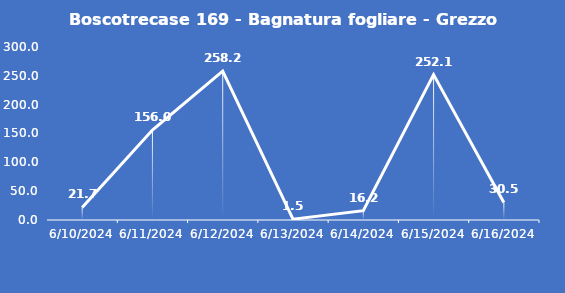
| Category | Boscotrecase 169 - Bagnatura fogliare - Grezzo (min) |
|---|---|
| 6/10/24 | 21.7 |
| 6/11/24 | 156 |
| 6/12/24 | 258.2 |
| 6/13/24 | 1.5 |
| 6/14/24 | 16.2 |
| 6/15/24 | 252.1 |
| 6/16/24 | 30.5 |